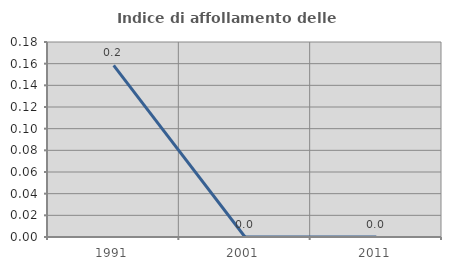
| Category | Indice di affollamento delle abitazioni  |
|---|---|
| 1991.0 | 0.158 |
| 2001.0 | 0 |
| 2011.0 | 0 |